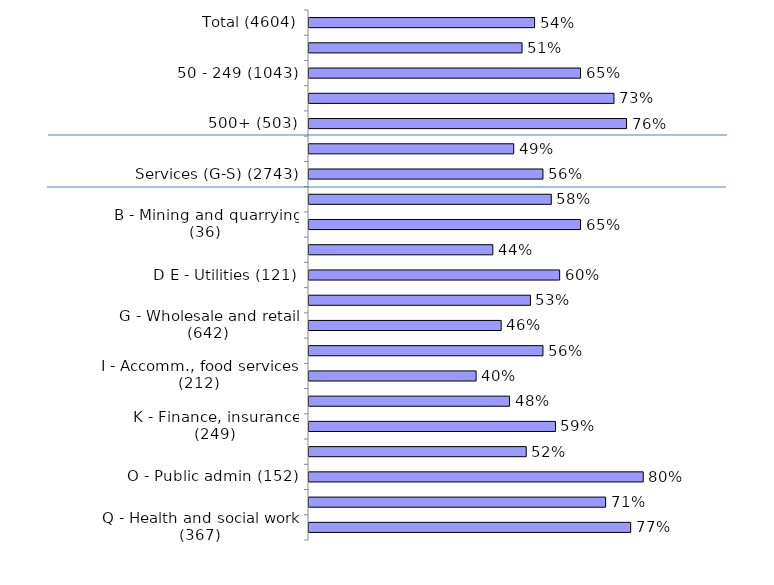
| Category | Yes |
|---|---|
| Total (4604) | 0.54 |
| 10 - 49 (2678) | 0.51 |
| 50 - 249 (1043) | 0.65 |
| 250 - 499 (380) | 0.73 |
| 500+ (503) | 0.76 |
| Production (A-F) (1861) | 0.49 |
| Services (G-S) (2743) | 0.56 |
| A - Agriculture (135) | 0.58 |
| B - Mining and quarrying (36) | 0.65 |
| C - Manufacturing (1396) | 0.44 |
| D E - Utilities (121) | 0.6 |
| F - Construction (173) | 0.53 |
| G - Wholesale and retail (642) | 0.46 |
| H - Transport , storage (203) | 0.56 |
| I - Accomm., food services (212) | 0.4 |
| J - Information, comms (170) | 0.48 |
| K - Finance, insurance (249) | 0.59 |
| LMNRS - Bus/tech/admin/arts/other (366) | 0.52 |
| O - Public admin (152) | 0.8 |
| P - Education (382) | 0.71 |
| Q - Health and social work (367) | 0.77 |